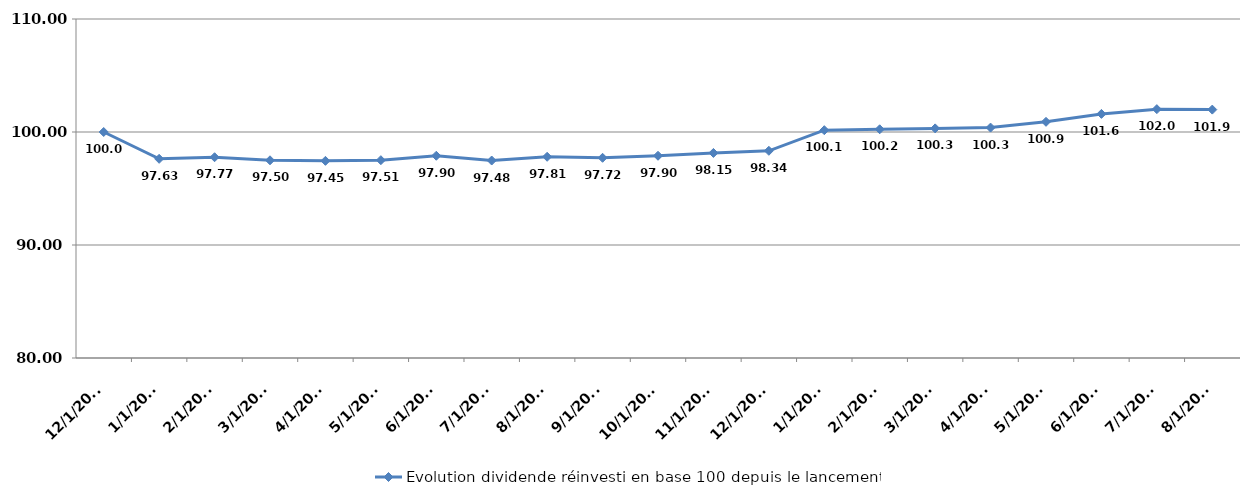
| Category | Evolution dividende réinvesti en base 100 depuis le lancement |
|---|---|
| 12/1/17 | 100 |
| 1/1/18 | 97.627 |
| 2/1/18 | 97.767 |
| 3/1/18 | 97.496 |
| 4/1/18 | 97.446 |
| 5/1/18 | 97.507 |
| 6/1/18 | 97.897 |
| 7/1/18 | 97.476 |
| 8/1/18 | 97.807 |
| 9/1/18 | 97.717 |
| 10/1/18 | 97.897 |
| 11/1/18 | 98.147 |
| 12/1/18 | 98.338 |
| 1/1/19 | 100.16 |
| 2/1/19 | 100.24 |
| 3/1/19 | 100.32 |
| 4/1/19 | 100.391 |
| 5/1/19 | 100.901 |
| 6/1/19 | 101.602 |
| 7/1/19 | 102.023 |
| 8/1/19 | 101.983 |